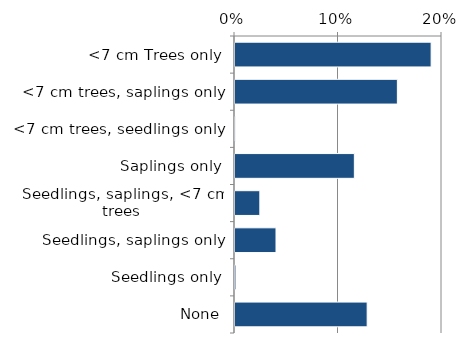
| Category | Non native |
|---|---|
| None | 0.128 |
| Seedlings only | 0.001 |
| Seedlings, saplings only | 0.04 |
| Seedlings, saplings, <7 cm trees | 0.024 |
| Saplings only | 0.115 |
| <7 cm trees, seedlings only | 0 |
| <7 cm trees, saplings only | 0.157 |
| <7 cm Trees only | 0.189 |